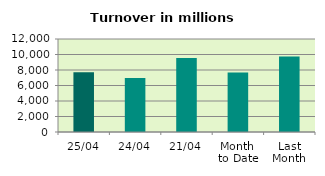
| Category | Series 0 |
|---|---|
| 25/04 | 7710.744 |
| 24/04 | 6953.334 |
| 21/04 | 9536.39 |
| Month 
to Date | 7668.99 |
| Last
Month | 9734.736 |